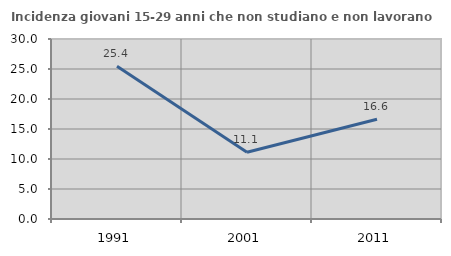
| Category | Incidenza giovani 15-29 anni che non studiano e non lavorano  |
|---|---|
| 1991.0 | 25.442 |
| 2001.0 | 11.124 |
| 2011.0 | 16.619 |